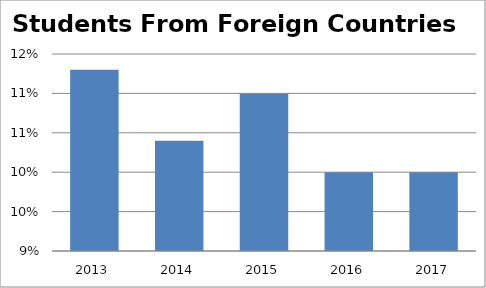
| Category | Series 0 |
|---|---|
| 2013.0 | 0.113 |
| 2014.0 | 0.104 |
| 2015.0 | 0.11 |
| 2016.0 | 0.1 |
| 2017.0 | 0.1 |